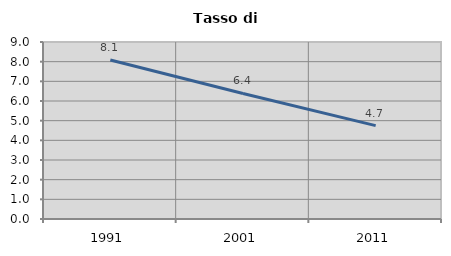
| Category | Tasso di disoccupazione   |
|---|---|
| 1991.0 | 8.084 |
| 2001.0 | 6.383 |
| 2011.0 | 4.748 |